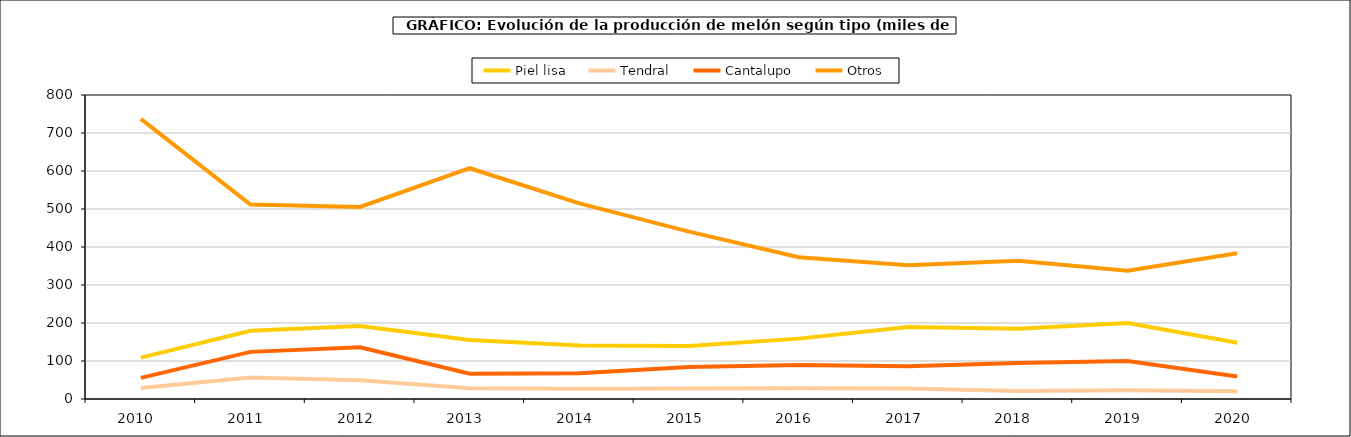
| Category | Piel lisa | Tendral | Cantalupo | Otros |
|---|---|---|---|---|
| 2010.0 | 108.94 | 28.98 | 55.599 | 737.036 |
| 2011.0 | 179.519 | 56.591 | 124.015 | 511.871 |
| 2012.0 | 191.896 | 49.169 | 136.333 | 505.471 |
| 2013.0 | 155.121 | 28.073 | 66.453 | 607.304 |
| 2014.0 | 140.682 | 27.23 | 67.816 | 514.864 |
| 2015.0 | 139.486 | 27.748 | 84.305 | 440.517 |
| 2016.0 | 158.886 | 28.45 | 89.425 | 373.006 |
| 2017.0 | 189.59 | 27.88 | 86.499 | 351.708 |
| 2018.0 | 184.675 | 21.163 | 94.594 | 363.921 |
| 2019.0 | 199.826 | 22.833 | 100.181 | 337.351 |
| 2020.0 | 147.925 | 20.256 | 59.257 | 383.54 |